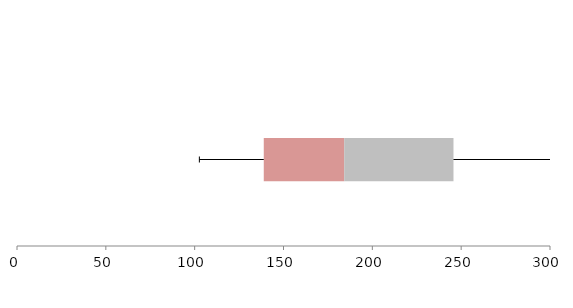
| Category | Series 1 | Series 2 | Series 3 |
|---|---|---|---|
| 0 | 138.893 | 45.278 | 61.502 |